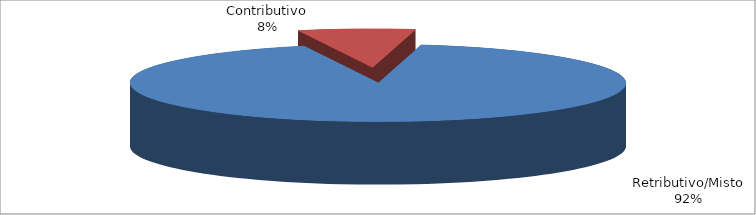
| Category | Decorrenti gennaio - settembre 2022 |
|---|---|
| Retributivo/Misto | 51054 |
| Contributivo | 4203 |